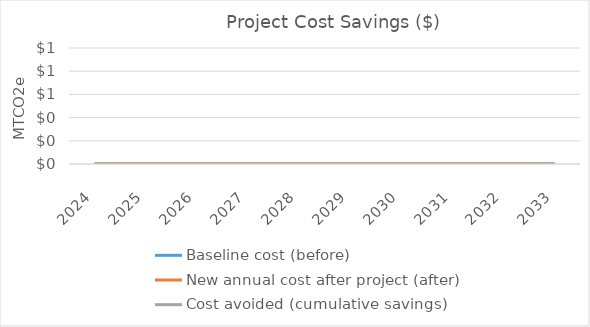
| Category | Baseline cost (before) | New annual cost after project (after) | Cost avoided (cumulative savings) |
|---|---|---|---|
| 0 | 0 | 0 |  |
| 1 | 0 | 0 |  |
| 2 | 0 | 0 |  |
| 3 | 0 | 0 |  |
| 4 | 0 | 0 |  |
| 5 | 0 | 0 |  |
| 6 | 0 | 0 |  |
| 7 | 0 | 0 |  |
| 8 | 0 | 0 |  |
| 9 | 0 | 0 |  |